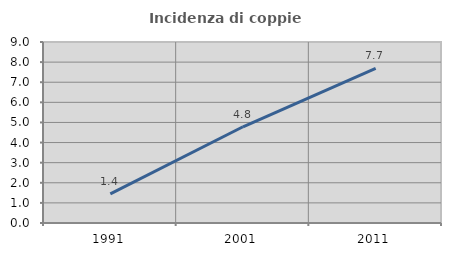
| Category | Incidenza di coppie miste |
|---|---|
| 1991.0 | 1.449 |
| 2001.0 | 4.785 |
| 2011.0 | 7.692 |